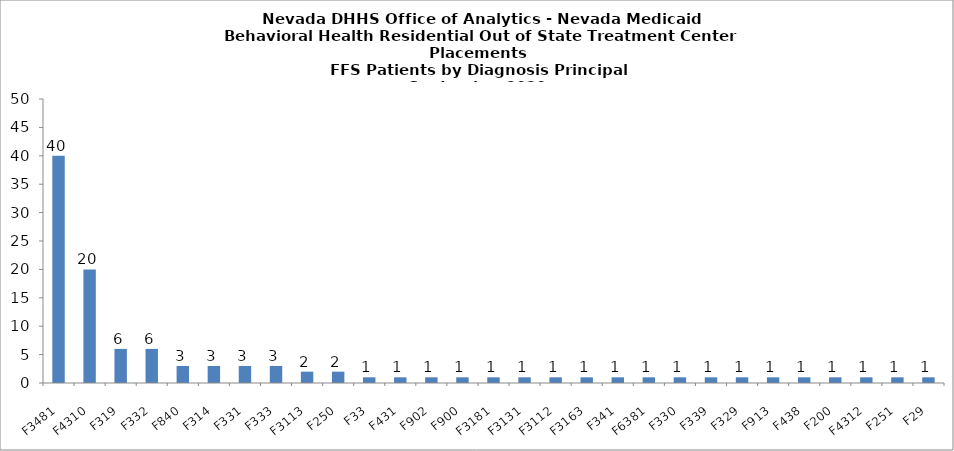
| Category | Series 0 |
|---|---|
| F3481 | 40 |
| F4310 | 20 |
| F319 | 6 |
| F332 | 6 |
| F840 | 3 |
| F314 | 3 |
| F331 | 3 |
| F333 | 3 |
| F3113 | 2 |
| F250 | 2 |
| F33 | 1 |
| F431 | 1 |
| F902 | 1 |
| F900 | 1 |
| F3181 | 1 |
| F3131 | 1 |
| F3112 | 1 |
| F3163 | 1 |
| F341 | 1 |
| F6381 | 1 |
| F330 | 1 |
| F339 | 1 |
| F329 | 1 |
| F913 | 1 |
| F438 | 1 |
| F200 | 1 |
| F4312 | 1 |
| F251 | 1 |
| F29 | 1 |